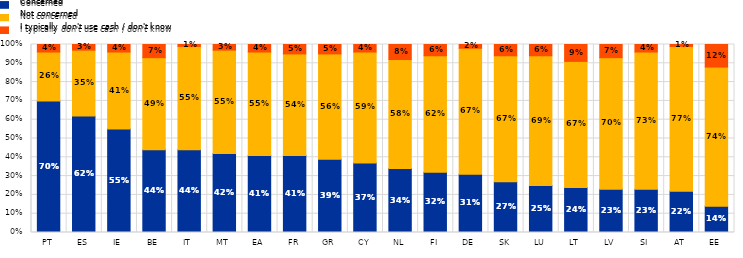
| Category | Concerned | Not concerned | I typically don't use cash / don't know |
|---|---|---|---|
| PT | 0.7 | 0.26 | 0.04 |
| ES | 0.62 | 0.35 | 0.03 |
| IE | 0.55 | 0.41 | 0.04 |
| BE | 0.44 | 0.49 | 0.07 |
| IT | 0.44 | 0.55 | 0.01 |
| MT | 0.42 | 0.55 | 0.03 |
| EA | 0.41 | 0.55 | 0.04 |
| FR | 0.41 | 0.54 | 0.05 |
| GR | 0.39 | 0.56 | 0.05 |
| CY | 0.37 | 0.59 | 0.04 |
| NL | 0.34 | 0.58 | 0.08 |
| FI | 0.32 | 0.62 | 0.06 |
| DE | 0.31 | 0.67 | 0.02 |
| SK | 0.27 | 0.67 | 0.06 |
| LU | 0.25 | 0.69 | 0.06 |
| LT | 0.24 | 0.67 | 0.09 |
| LV | 0.23 | 0.7 | 0.07 |
| SI | 0.23 | 0.73 | 0.04 |
| AT | 0.22 | 0.77 | 0.01 |
| EE | 0.14 | 0.74 | 0.12 |